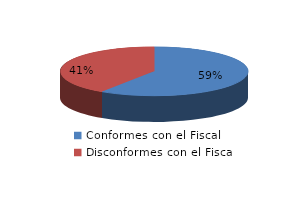
| Category | Series 0 |
|---|---|
| 0 | 102 |
| 1 | 70 |